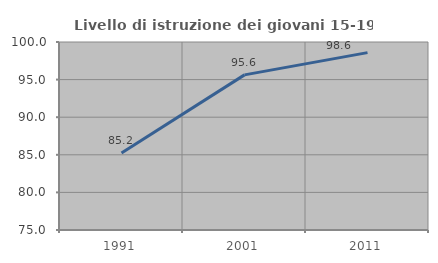
| Category | Livello di istruzione dei giovani 15-19 anni |
|---|---|
| 1991.0 | 85.238 |
| 2001.0 | 95.628 |
| 2011.0 | 98.585 |